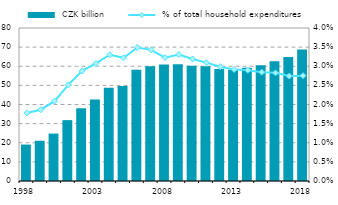
| Category |  CZK billion |
|---|---|
| 1998.0 | 19.046 |
| 1999.0 | 21.046 |
| 2000.0 | 24.782 |
| 2001.0 | 31.82 |
| 2002.0 | 38.038 |
| 2003.0 | 42.624 |
| 2004.0 | 48.765 |
| 2005.0 | 49.657 |
| 2006.0 | 58.175 |
| 2007.0 | 60.049 |
| 2008.0 | 60.854 |
| 2009.0 | 61.08 |
| 2010.0 | 60.266 |
| 2011.0 | 59.982 |
| 2012.0 | 58.552 |
| 2013.0 | 58.226 |
| 2014.0 | 59.202 |
| 2015.0 | 60.464 |
| 2016.0 | 62.573 |
| 2017.0 | 64.78 |
| 2018.0 | 68.727 |